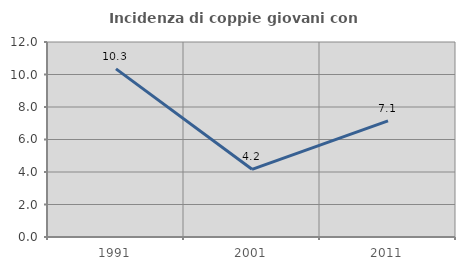
| Category | Incidenza di coppie giovani con figli |
|---|---|
| 1991.0 | 10.345 |
| 2001.0 | 4.167 |
| 2011.0 | 7.143 |